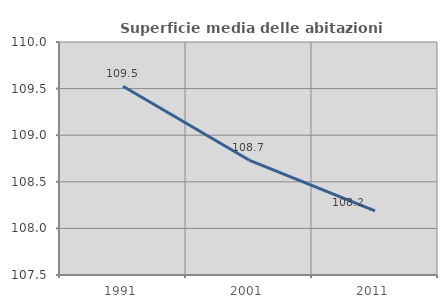
| Category | Superficie media delle abitazioni occupate |
|---|---|
| 1991.0 | 109.526 |
| 2001.0 | 108.733 |
| 2011.0 | 108.189 |